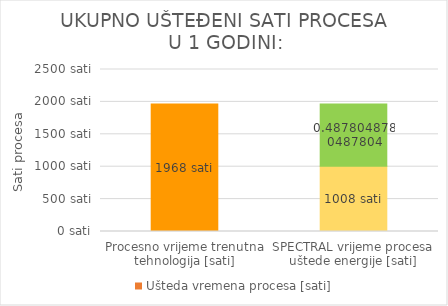
| Category | Procesno vrijeme trenutna tehnologija [sati] | Ušteda vremena procesa [sati] |
|---|---|---|
| Procesno vrijeme trenutna tehnologija [sati] | 1968 | 0 |
| SPECTRAL vrijeme procesa uštede energije [sati] | 1008 | 960 |